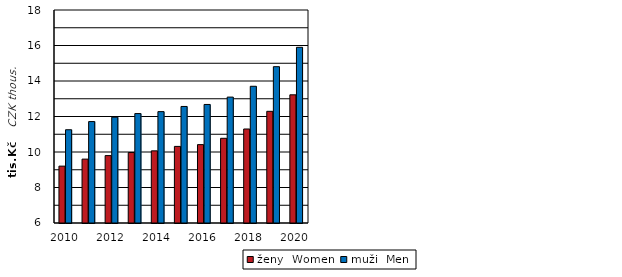
| Category | ženy  Women | muži  Men |
|---|---|---|
| 2010.0 | 9204 | 11254 |
| 2011.0 | 9599 | 11714 |
| 2012.0 | 9797 | 11962 |
| 2013.0 | 9970 | 12165 |
| 2014.0 | 10065 | 12274 |
| 2015.0 | 10316 | 12566 |
| 2016.0 | 10416 | 12678 |
| 2017.0 | 10772 | 13093 |
| 2018.0 | 11296 | 13703 |
| 2019.0 | 12292 | 14807 |
| 2020.0 | 13221 | 15898 |